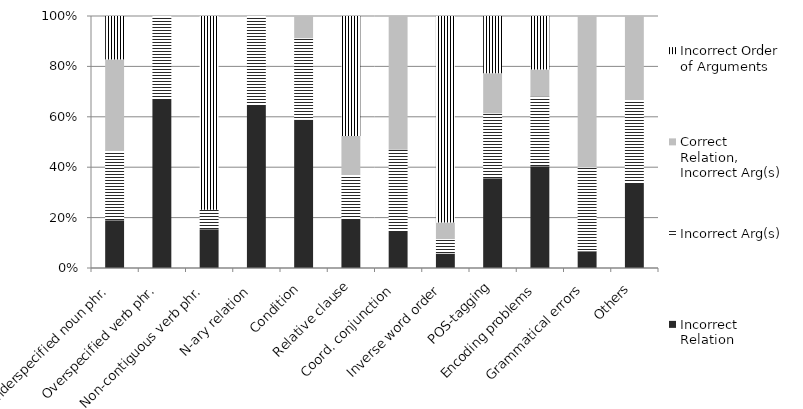
| Category | Incorrect Relation | Incorrect Arg(s) | Correct Relation, Incorrect Arg(s) | Incorrect Order of Arguments  |
|---|---|---|---|---|
| Underspecified noun phr. | 0.11 | 0.16 | 0.21 | 0.1 |
| Overspecified verb phr. | 0.02 | 0.01 | 0 | 0 |
| Non-contiguous verb phr. | 0.04 | 0.02 | 0 | 0.2 |
| N-ary relation   | 0.09 | 0.05 | 0 | 0 |
| Condition | 0.2 | 0.11 | 0.03 | 0 |
| Relative clause | 0.16 | 0.15 | 0.13 | 0.4 |
| Coord. conjunction | 0.07 | 0.16 | 0.26 | 0 |
| Inverse word order | 0.07 | 0.07 | 0.08 | 1 |
| POS-tagging | 0.47 | 0.34 | 0.21 | 0.3 |
| Encoding problems | 0.38 | 0.26 | 0.1 | 0.2 |
| Grammatical errors | 0.02 | 0.1 | 0.18 | 0 |
| Others | 0.13 | 0.13 | 0.13 | 0 |